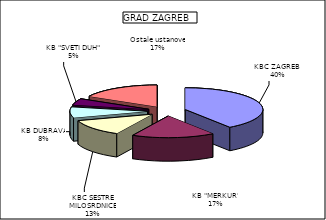
| Category | Series 0 |
|---|---|
| KBC ZAGREB  | 40.25 |
| KB "MERKUR" | 17.299 |
| KBC SESTRE MILOSRDNICE | 12.634 |
| KB DUBRAVA | 8.082 |
| KB "SVETI DUH" | 4.786 |
| Ostale ustanove | 16.948 |